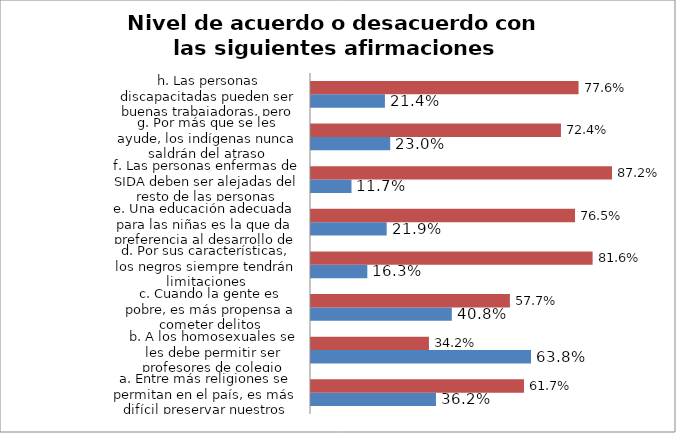
| Category | Acuerdo | Desacuerdo |
|---|---|---|
| a. Entre más religiones se permitan en el país, es más difícil preservar nuestros valores | 0.362 | 0.617 |
| b. A los homosexuales se les debe permitir ser profesores de colegio | 0.638 | 0.342 |
| c. Cuando la gente es pobre, es más propensa a cometer delitos | 0.408 | 0.577 |
| d. Por sus características, los negros siempre tendrán limitaciones | 0.163 | 0.816 |
| e. Una educación adecuada para las niñas es la que da preferencia al desarrollo de sus roles de madre y esposa | 0.219 | 0.765 |
| f. Las personas enfermas de SIDA deben ser alejadas del resto de las personas | 0.117 | 0.872 |
| g. Por más que se les ayude, los indígenas nunca saldrán del atraso | 0.23 | 0.724 |
| h. Las personas discapacitadas pueden ser buenas trabajadoras, pero no en niveles directivos | 0.214 | 0.776 |